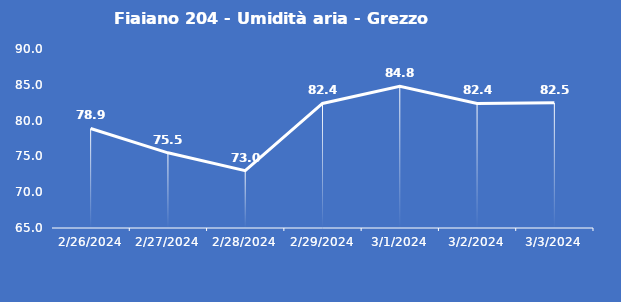
| Category | Fiaiano 204 - Umidità aria - Grezzo (%) |
|---|---|
| 2/26/24 | 78.9 |
| 2/27/24 | 75.5 |
| 2/28/24 | 73 |
| 2/29/24 | 82.4 |
| 3/1/24 | 84.8 |
| 3/2/24 | 82.4 |
| 3/3/24 | 82.5 |